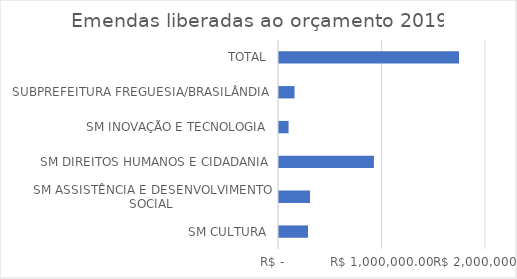
| Category | Series 0 |
|---|---|
| SM CULTURA | 280000 |
| SM ASSISTÊNCIA E DESENVOLVIMENTO SOCIAL | 300000 |
| SM DIREITOS HUMANOS E CIDADANIA | 917000 |
| SM INOVAÇÃO E TECNOLOGIA | 92400 |
| SUBPREFEITURA FREGUESIA/BRASILÂNDIA | 150000 |
| TOTAL | 1739400 |